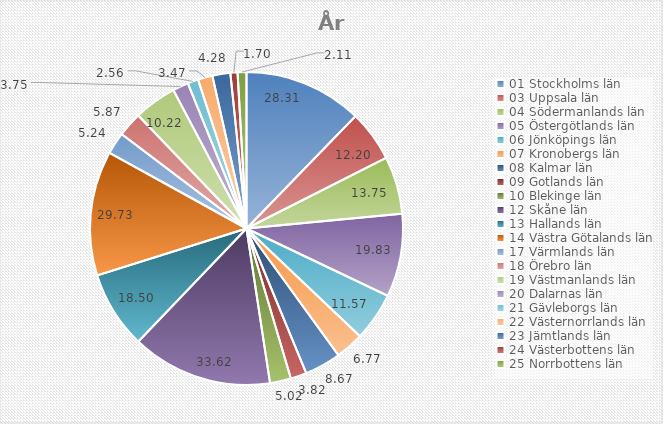
| Category | Series 0 |
|---|---|
| 01 Stockholms län | 28.31 |
| 03 Uppsala län | 12.2 |
| 04 Södermanlands län | 13.75 |
| 05 Östergötlands län | 19.83 |
| 06 Jönköpings län | 11.57 |
| 07 Kronobergs län | 6.77 |
| 08 Kalmar län | 8.67 |
| 09 Gotlands län | 3.82 |
| 10 Blekinge län | 5.02 |
| 12 Skåne län | 33.62 |
| 13 Hallands län | 18.5 |
| 14 Västra Götalands län | 29.73 |
| 17 Värmlands län | 5.24 |
| 18 Örebro län | 5.87 |
| 19 Västmanlands län | 10.22 |
| 20 Dalarnas län | 3.75 |
| 21 Gävleborgs län | 2.56 |
| 22 Västernorrlands län | 3.47 |
| 23 Jämtlands län | 4.28 |
| 24 Västerbottens län | 1.7 |
| 25 Norrbottens län | 2.11 |